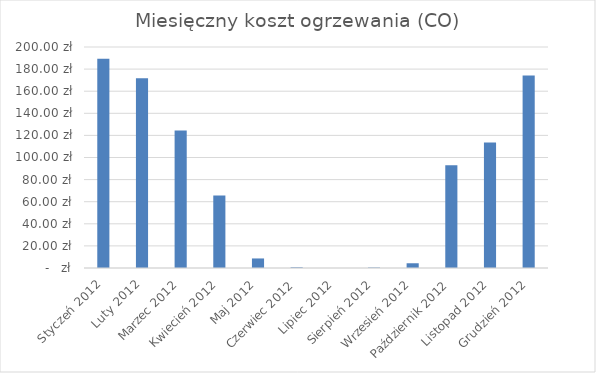
| Category | Series 0 |
|---|---|
| Styczeń 2012 | 189.277 |
| Luty 2012 | 171.717 |
| Marzec 2012 | 124.444 |
| Kwiecień 2012 | 65.579 |
| Maj 2012 | 8.64 |
| Czerwiec 2012 | 0.622 |
| Lipiec 2012 | 0 |
| Sierpień 2012 | 0.412 |
| Wrzesień 2012 | 4.294 |
| Październik 2012 | 92.951 |
| Listopad 2012 | 113.63 |
| Grudzień 2012 | 174.154 |